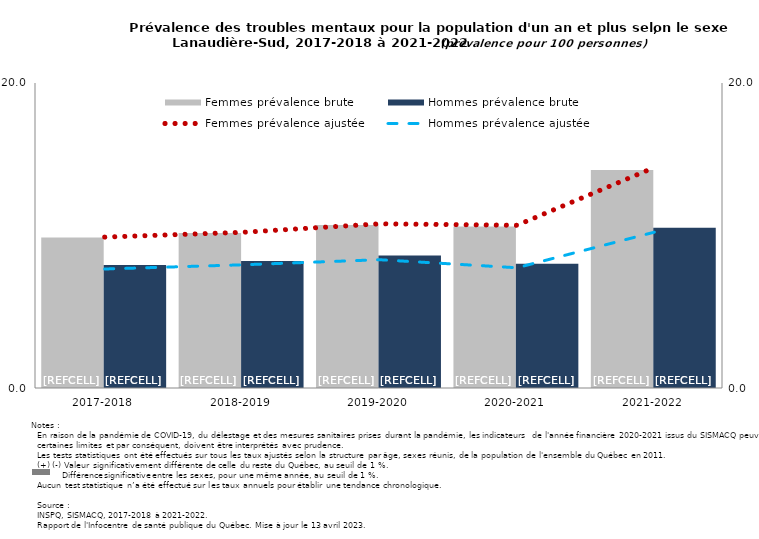
| Category | Femmes prévalence brute | Hommes prévalence brute |
|---|---|---|
| 2017-2018 | 9.862 | 8.059 |
| 2018-2019 | 10.163 | 8.335 |
| 2019-2020 | 10.695 | 8.69 |
| 2020-2021 | 10.585 | 8.146 |
| 2021-2022 | 14.3 | 10.507 |